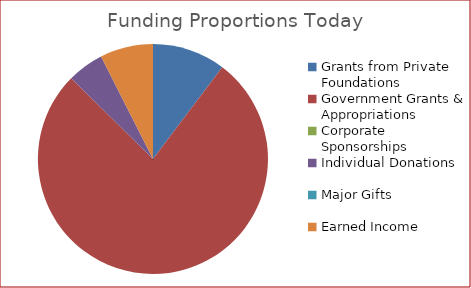
| Category | Series 0 | Series 1 |
|---|---|---|
| Grants from Private Foundations | 20000 | 0.103 |
| Government Grants & Appropriations | 150000 | 0.771 |
| Corporate Sponsorships | 0 | 0 |
| Individual Donations | 10000 | 0.051 |
| Major Gifts | 0 | 0 |
| Earned Income | 14500 | 0.075 |